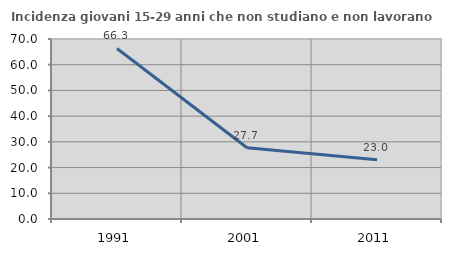
| Category | Incidenza giovani 15-29 anni che non studiano e non lavorano  |
|---|---|
| 1991.0 | 66.31 |
| 2001.0 | 27.697 |
| 2011.0 | 23.034 |